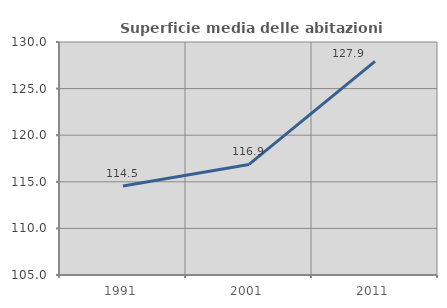
| Category | Superficie media delle abitazioni occupate |
|---|---|
| 1991.0 | 114.545 |
| 2001.0 | 116.864 |
| 2011.0 | 127.916 |